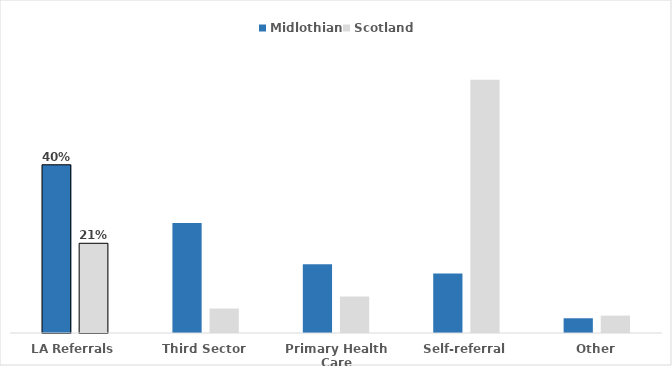
| Category | Midlothian | Scotland |
|---|---|---|
| LA Referrals | 0.399 | 0.213 |
| Third Sector | 0.261 | 0.058 |
| Primary Health Care | 0.163 | 0.087 |
| Self-referral | 0.141 | 0.601 |
| Other | 0.035 | 0.041 |